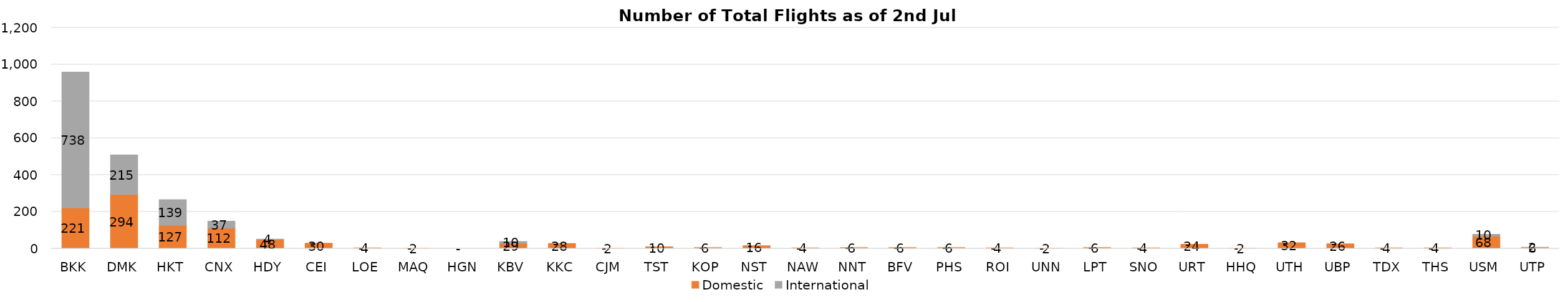
| Category | Domestic | International |
|---|---|---|
| BKK | 221 | 738 |
| DMK | 294 | 215 |
| HKT | 127 | 139 |
| CNX | 112 | 37 |
| HDY | 48 | 4 |
| CEI | 30 | 0 |
| LOE | 4 | 0 |
| MAQ | 2 | 0 |
| HGN | 0 | 0 |
| KBV | 29 | 10 |
| KKC | 28 | 0 |
| CJM | 2 | 0 |
| TST | 10 | 0 |
| KOP | 6 | 0 |
| NST | 16 | 0 |
| NAW | 4 | 0 |
| NNT | 6 | 0 |
| BFV | 6 | 0 |
| PHS | 6 | 0 |
| ROI | 4 | 0 |
| UNN | 2 | 0 |
| LPT | 6 | 0 |
| SNO | 4 | 0 |
| URT | 24 | 0 |
| HHQ | 2 | 0 |
| UTH | 32 | 0 |
| UBP | 26 | 0 |
| TDX | 4 | 0 |
| THS | 4 | 0 |
| USM | 68 | 10 |
| UTP | 6 | 2 |